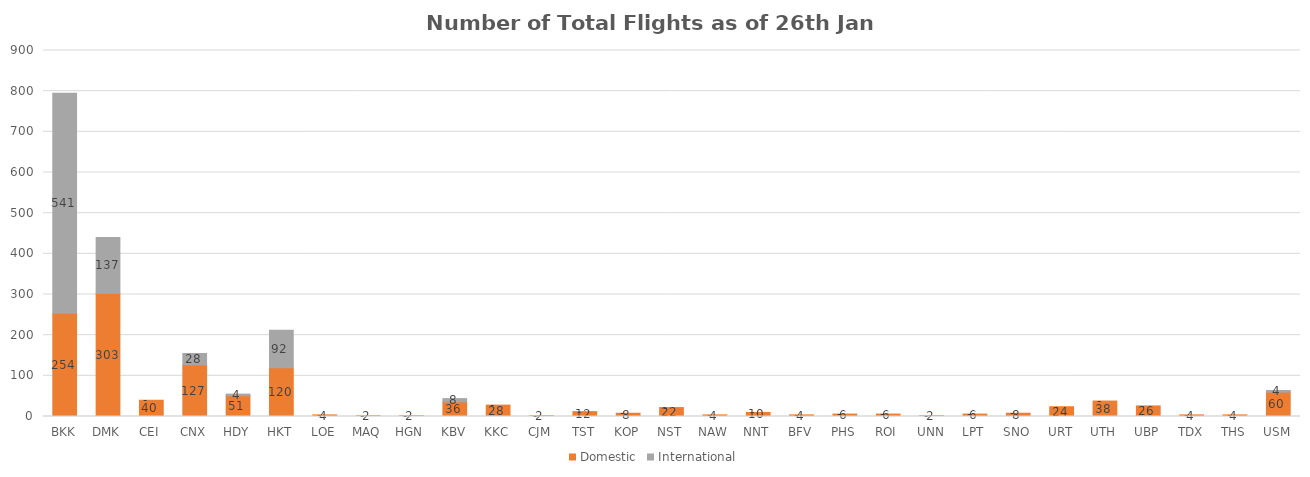
| Category | Domestic | International |
|---|---|---|
| BKK | 254 | 541 |
| DMK | 303 | 137 |
| CEI | 40 | 0 |
| CNX | 127 | 28 |
| HDY | 51 | 4 |
| HKT | 120 | 92 |
| LOE | 4 | 0 |
| MAQ | 2 | 0 |
| HGN | 2 | 0 |
| KBV | 36 | 8 |
| KKC | 28 | 0 |
| CJM | 2 | 0 |
| TST | 12 | 0 |
| KOP | 8 | 0 |
| NST | 22 | 0 |
| NAW | 4 | 0 |
| NNT | 10 | 0 |
| BFV | 4 | 0 |
| PHS | 6 | 0 |
| ROI | 6 | 0 |
| UNN | 2 | 0 |
| LPT | 6 | 0 |
| SNO | 8 | 0 |
| URT | 24 | 0 |
| UTH | 38 | 0 |
| UBP | 26 | 0 |
| TDX | 4 | 0 |
| THS | 4 | 0 |
| USM | 60 | 4 |